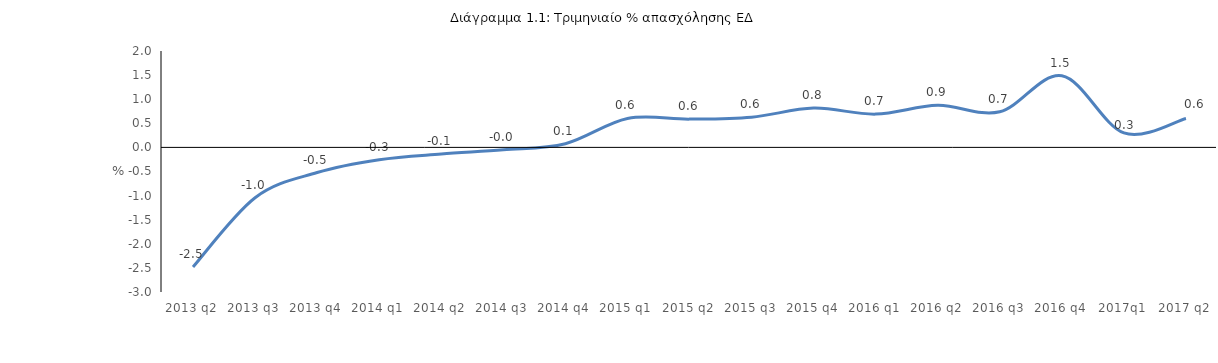
| Category | Series 0 |
|---|---|
| 2013 q2 | -2.479 |
| 2013 q3 | -1.044 |
| 2013 q4 | -0.522 |
| 2014 q1 | -0.255 |
| 2014 q2 | -0.138 |
| 2014 q3 | -0.05 |
| 2014 q4 | 0.077 |
| 2015 q1 | 0.6 |
| 2015 q2 | 0.587 |
| 2015 q3 | 0.627 |
| 2015 q4 | 0.815 |
| 2016 q1 | 0.69 |
| 2016 q2 | 0.872 |
| 2016 q3 | 0.738 |
| 2016 q4 | 1.486 |
| 2017q1 | 0.3 |
| 2017 q2 | 0.6 |